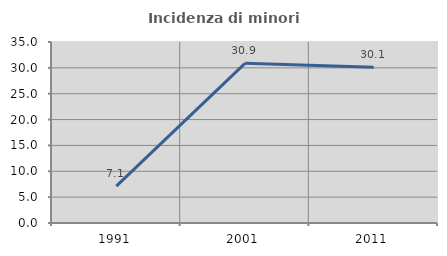
| Category | Incidenza di minori stranieri |
|---|---|
| 1991.0 | 7.143 |
| 2001.0 | 30.882 |
| 2011.0 | 30.108 |